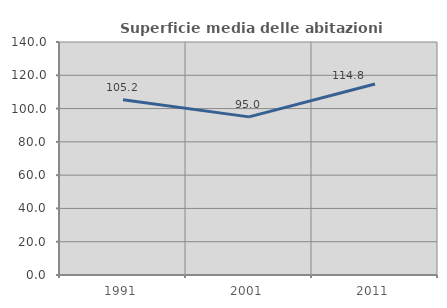
| Category | Superficie media delle abitazioni occupate |
|---|---|
| 1991.0 | 105.235 |
| 2001.0 | 95.019 |
| 2011.0 | 114.783 |